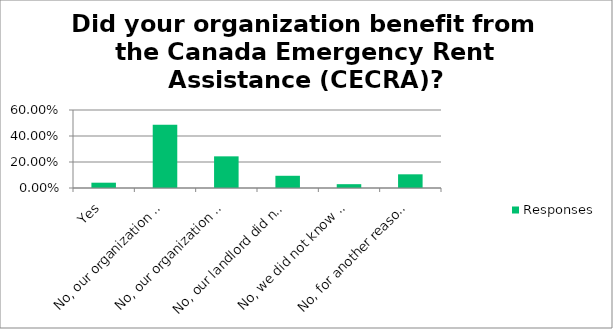
| Category | Responses |
|---|---|
| Yes | 0.041 |
| No, our organization did not need it. | 0.487 |
| No, our organization was not eligible. | 0.244 |
| No, our landlord did not apply for it. | 0.094 |
| No, we did not know about it/did not know how to apply. | 0.029 |
| No, for another reason (please explain): | 0.105 |